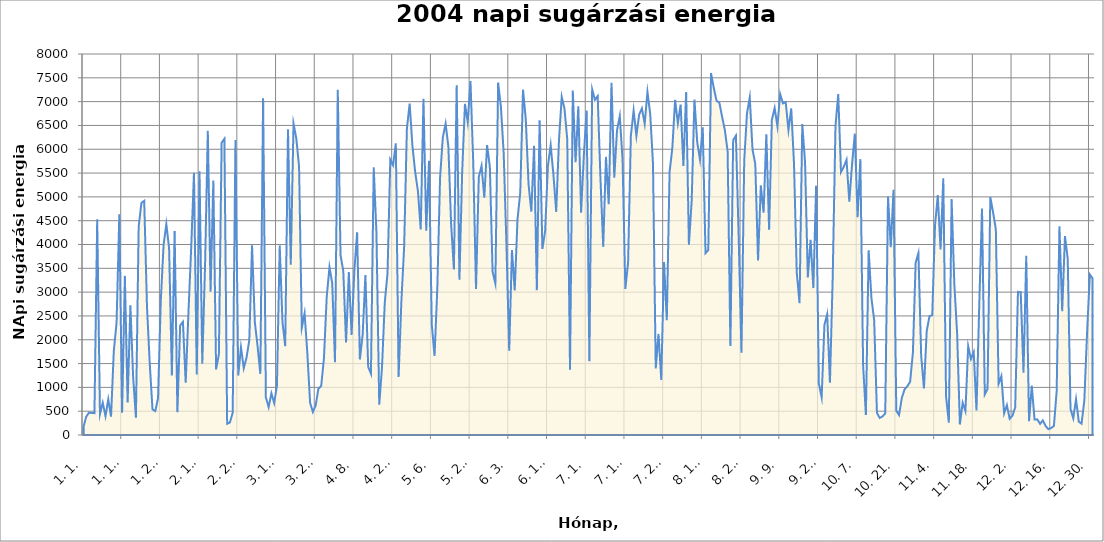
| Category | Series 0 |
|---|---|
| 37987.0 | 161 |
| 37988.0 | 381 |
| 37989.0 | 468 |
| 37990.0 | 462 |
| 37991.0 | 459 |
| 37992.0 | 4532 |
| 37993.0 | 441 |
| 37994.0 | 679 |
| 37995.0 | 395 |
| 37996.0 | 751 |
| 37997.0 | 385 |
| 37998.0 | 1760 |
| 37999.0 | 2357 |
| 38000.0 | 4636 |
| 38001.0 | 466 |
| 38002.0 | 3343 |
| 38003.0 | 683 |
| 38004.0 | 2725 |
| 38005.0 | 1213 |
| 38006.0 | 364 |
| 38007.0 | 4379 |
| 38008.0 | 4875 |
| 38009.0 | 4917 |
| 38010.0 | 2698 |
| 38011.0 | 1499 |
| 38012.0 | 537 |
| 38013.0 | 502 |
| 38014.0 | 772 |
| 38015.0 | 2824 |
| 38016.0 | 3989 |
| 38017.0 | 4429 |
| 38018.0 | 3920 |
| 38019.0 | 1252 |
| 38020.0 | 4283 |
| 38021.0 | 478 |
| 38022.0 | 2300 |
| 38023.0 | 2376 |
| 38024.0 | 1098 |
| 38025.0 | 2571 |
| 38026.0 | 3946 |
| 38027.0 | 5507 |
| 38028.0 | 1272 |
| 38029.0 | 5536 |
| 38030.0 | 1497 |
| 38031.0 | 3545 |
| 38032.0 | 6386 |
| 38033.0 | 3009 |
| 38034.0 | 5344 |
| 38035.0 | 1378 |
| 38036.0 | 1694 |
| 38037.0 | 6137 |
| 38038.0 | 6220 |
| 38039.0 | 235 |
| 38040.0 | 264 |
| 38041.0 | 467 |
| 38042.0 | 6196 |
| 38043.0 | 1248 |
| 38044.0 | 1842 |
| 38045.0 | 1403 |
| 38046.0 | 1625 |
| 38047.0 | 1990 |
| 38048.0 | 3981 |
| 38049.0 | 2377 |
| 38050.0 | 1864 |
| 38051.0 | 1282 |
| 38052.0 | 7070 |
| 38053.0 | 791 |
| 38054.0 | 587 |
| 38055.0 | 877 |
| 38056.0 | 673 |
| 38057.0 | 1032 |
| 38058.0 | 3981 |
| 38059.0 | 2377 |
| 38060.0 | 1864 |
| 38061.0 | 6418 |
| 38062.0 | 3574 |
| 38063.0 | 6537 |
| 38064.0 | 6231 |
| 38065.0 | 5643 |
| 38066.0 | 2254 |
| 38067.0 | 2555 |
| 38068.0 | 1718 |
| 38069.0 | 675 |
| 38070.0 | 484 |
| 38071.0 | 618 |
| 38072.0 | 973 |
| 38073.0 | 1027 |
| 38074.0 | 1609 |
| 38075.0 | 2898 |
| 38076.0 | 3526 |
| 38077.0 | 3185 |
| 38078.0 | 1526 |
| 38079.0 | 7250 |
| 38080.0 | 3778 |
| 38081.0 | 3442 |
| 38082.0 | 1943 |
| 38083.0 | 3421 |
| 38084.0 | 2103 |
| 38085.0 | 3456 |
| 38086.0 | 4254 |
| 38087.0 | 1588 |
| 38088.0 | 2109 |
| 38089.0 | 3361 |
| 38090.0 | 1430 |
| 38091.0 | 1290 |
| 38092.0 | 5619 |
| 38093.0 | 4231 |
| 38094.0 | 635 |
| 38095.0 | 1424 |
| 38096.0 | 2782 |
| 38097.0 | 3399 |
| 38098.0 | 5782 |
| 38099.0 | 5665 |
| 38100.0 | 6125 |
| 38101.0 | 1219 |
| 38102.0 | 2802 |
| 38103.0 | 3943 |
| 38104.0 | 6431 |
| 38105.0 | 6961 |
| 38106.0 | 6073 |
| 38107.0 | 5520 |
| 38108.0 | 5119 |
| 38109.0 | 4317 |
| 38110.0 | 7061 |
| 38111.0 | 4290 |
| 38112.0 | 5759 |
| 38113.0 | 2323 |
| 38114.0 | 1660 |
| 38115.0 | 3080 |
| 38116.0 | 5402 |
| 38117.0 | 6253 |
| 38118.0 | 6538 |
| 38119.0 | 6055 |
| 38120.0 | 4428 |
| 38121.0 | 3476 |
| 38122.0 | 7344 |
| 38123.0 | 3260 |
| 38124.0 | 5530 |
| 38125.0 | 6953 |
| 38126.0 | 6572 |
| 38127.0 | 7432 |
| 38128.0 | 5714 |
| 38129.0 | 3067 |
| 38130.0 | 5418 |
| 38131.0 | 5650 |
| 38132.0 | 4981 |
| 38133.0 | 6087 |
| 38134.0 | 5634 |
| 38135.0 | 3428 |
| 38136.0 | 3179 |
| 38137.0 | 7402 |
| 38138.0 | 6891 |
| 38139.0 | 5930 |
| 38140.0 | 4012 |
| 38141.0 | 1770 |
| 38142.0 | 3885 |
| 38143.0 | 3033 |
| 38144.0 | 4526 |
| 38145.0 | 5091 |
| 38146.0 | 7251 |
| 38147.0 | 6626 |
| 38148.0 | 5264 |
| 38149.0 | 4690 |
| 38150.0 | 6075 |
| 38151.0 | 3038 |
| 38152.0 | 6610 |
| 38153.0 | 3905 |
| 38154.0 | 4290 |
| 38155.0 | 5650 |
| 38156.0 | 6085 |
| 38157.0 | 5464 |
| 38158.0 | 4686 |
| 38159.0 | 6185 |
| 38160.0 | 7100 |
| 38161.0 | 6850 |
| 38162.0 | 6205 |
| 38163.0 | 1368 |
| 38164.0 | 7232 |
| 38165.0 | 5726 |
| 38166.0 | 6901 |
| 38167.0 | 4669 |
| 38168.0 | 5877 |
| 38169.0 | 6813 |
| 38170.0 | 1551 |
| 38171.0 | 7259 |
| 38172.0 | 7039 |
| 38173.0 | 7117 |
| 38174.0 | 5395 |
| 38175.0 | 3949 |
| 38176.0 | 5839 |
| 38177.0 | 4844 |
| 38178.0 | 7397 |
| 38179.0 | 5404 |
| 38180.0 | 6399 |
| 38181.0 | 6700 |
| 38182.0 | 5776 |
| 38183.0 | 3065 |
| 38184.0 | 3620 |
| 38185.0 | 6281 |
| 38186.0 | 6814 |
| 38187.0 | 6281 |
| 38188.0 | 6728 |
| 38189.0 | 6858 |
| 38190.0 | 6534 |
| 38191.0 | 7203 |
| 38192.0 | 6741 |
| 38193.0 | 5704 |
| 38194.0 | 1397 |
| 38195.0 | 2122 |
| 38196.0 | 1157 |
| 38197.0 | 3632 |
| 38198.0 | 2409 |
| 38199.0 | 5522 |
| 38200.0 | 6022 |
| 38201.0 | 7036 |
| 38202.0 | 6546 |
| 38203.0 | 6938 |
| 38204.0 | 5648 |
| 38205.0 | 7199 |
| 38206.0 | 3997 |
| 38207.0 | 4925 |
| 38208.0 | 7044 |
| 38209.0 | 6147 |
| 38210.0 | 5781 |
| 38211.0 | 6459 |
| 38212.0 | 3819 |
| 38213.0 | 3882 |
| 38214.0 | 7598 |
| 38215.0 | 7284 |
| 38216.0 | 7015 |
| 38217.0 | 6981 |
| 38218.0 | 6681 |
| 38219.0 | 6401 |
| 38220.0 | 5955 |
| 38221.0 | 1871 |
| 38222.0 | 6192 |
| 38223.0 | 6286 |
| 38224.0 | 4148 |
| 38225.0 | 1726 |
| 38226.0 | 5766 |
| 38227.0 | 6756 |
| 38228.0 | 7089 |
| 38229.0 | 5994 |
| 38230.0 | 5691 |
| 38231.0 | 3664 |
| 38232.0 | 5241 |
| 38233.0 | 4669 |
| 38234.0 | 6315 |
| 38235.0 | 4311 |
| 38236.0 | 6614 |
| 38237.0 | 6866 |
| 38238.0 | 6485 |
| 38239.0 | 7158 |
| 38240.0 | 6963 |
| 38241.0 | 6988 |
| 38242.0 | 6403 |
| 38243.0 | 6857 |
| 38244.0 | 5702 |
| 38245.0 | 3409 |
| 38246.0 | 2767 |
| 38247.0 | 6528 |
| 38248.0 | 5729 |
| 38249.0 | 3308 |
| 38250.0 | 4096 |
| 38251.0 | 3085 |
| 38252.0 | 5233 |
| 38253.0 | 1078 |
| 38254.0 | 791 |
| 38255.0 | 2313 |
| 38256.0 | 2536 |
| 38257.0 | 1096 |
| 38258.0 | 3308 |
| 38259.0 | 6485 |
| 38260.0 | 7158 |
| 38261.0 | 5521 |
| 38262.0 | 5631 |
| 38263.0 | 5779 |
| 38264.0 | 4901 |
| 38265.0 | 5682 |
| 38266.0 | 6328 |
| 38267.0 | 4573 |
| 38268.0 | 5792 |
| 38269.0 | 1465 |
| 38270.0 | 419 |
| 38271.0 | 3879 |
| 38272.0 | 2881 |
| 38273.0 | 2408 |
| 38274.0 | 466 |
| 38275.0 | 358 |
| 38276.0 | 390 |
| 38277.0 | 453 |
| 38278.0 | 5008 |
| 38279.0 | 3941 |
| 38280.0 | 5150 |
| 38281.0 | 508 |
| 38282.0 | 419 |
| 38283.0 | 781 |
| 38284.0 | 959 |
| 38285.0 | 1023 |
| 38286.0 | 1119 |
| 38287.0 | 1728 |
| 38288.0 | 3620 |
| 38289.0 | 3822 |
| 38290.0 | 1661 |
| 38291.0 | 976 |
| 38292.0 | 2184 |
| 38293.0 | 2494 |
| 38294.0 | 2515 |
| 38295.0 | 4396 |
| 38296.0 | 5037 |
| 38297.0 | 3898 |
| 38298.0 | 5392 |
| 38299.0 | 806 |
| 38300.0 | 257 |
| 38301.0 | 4956 |
| 38302.0 | 3157 |
| 38303.0 | 2130 |
| 38304.0 | 220 |
| 38305.0 | 676 |
| 38306.0 | 505 |
| 38307.0 | 1865 |
| 38308.0 | 1596 |
| 38309.0 | 1741 |
| 38310.0 | 513 |
| 38311.0 | 2737 |
| 38312.0 | 4755 |
| 38313.0 | 852 |
| 38314.0 | 965 |
| 38315.0 | 4997 |
| 38316.0 | 4676 |
| 38317.0 | 4319 |
| 38318.0 | 1075 |
| 38319.0 | 1236 |
| 38320.0 | 453 |
| 38321.0 | 626 |
| 38322.0 | 341 |
| 38323.0 | 404 |
| 38324.0 | 580 |
| 38325.0 | 3005 |
| 38326.0 | 2997 |
| 38327.0 | 1309 |
| 38328.0 | 3763 |
| 38329.0 | 288 |
| 38330.0 | 1036 |
| 38331.0 | 324 |
| 38332.0 | 328 |
| 38333.0 | 234 |
| 38334.0 | 307 |
| 38335.0 | 189 |
| 38336.0 | 123 |
| 38337.0 | 147 |
| 38338.0 | 190 |
| 38339.0 | 923 |
| 38340.0 | 4381 |
| 38341.0 | 2601 |
| 38342.0 | 4178 |
| 38343.0 | 3698 |
| 38344.0 | 548 |
| 38345.0 | 351 |
| 38346.0 | 751 |
| 38347.0 | 280 |
| 38348.0 | 238 |
| 38349.0 | 723 |
| 38350.0 | 2154 |
| 38351.0 | 3369 |
| 38352.0 | 3287 |